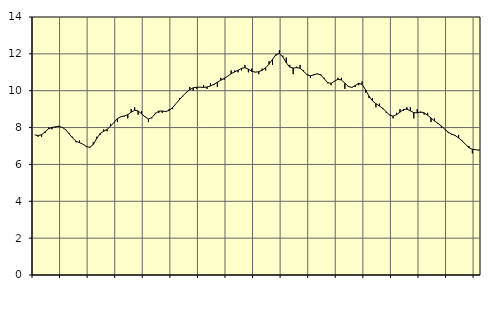
| Category | Piggar | Series 1 |
|---|---|---|
| nan | 7.6 | 7.6 |
| 87.0 | 7.5 | 7.57 |
| 87.0 | 7.5 | 7.61 |
| 87.0 | 7.7 | 7.77 |
| nan | 8 | 7.93 |
| 88.0 | 7.9 | 8.01 |
| 88.0 | 8 | 8.04 |
| 88.0 | 8.1 | 8.06 |
| nan | 8 | 8.01 |
| 89.0 | 7.9 | 7.88 |
| 89.0 | 7.7 | 7.66 |
| 89.0 | 7.5 | 7.43 |
| nan | 7.2 | 7.26 |
| 90.0 | 7.3 | 7.18 |
| 90.0 | 7.1 | 7.1 |
| 90.0 | 7 | 6.97 |
| nan | 6.9 | 6.93 |
| 91.0 | 7.2 | 7.09 |
| 91.0 | 7.5 | 7.41 |
| 91.0 | 7.6 | 7.68 |
| nan | 7.9 | 7.8 |
| 92.0 | 7.8 | 7.9 |
| 92.0 | 8.2 | 8.07 |
| 92.0 | 8.3 | 8.28 |
| nan | 8.3 | 8.49 |
| 93.0 | 8.6 | 8.59 |
| 93.0 | 8.6 | 8.63 |
| 93.0 | 8.5 | 8.7 |
| nan | 9 | 8.84 |
| 94.0 | 9.1 | 8.94 |
| 94.0 | 8.7 | 8.9 |
| 94.0 | 8.9 | 8.75 |
| nan | 8.6 | 8.58 |
| 95.0 | 8.3 | 8.47 |
| 95.0 | 8.5 | 8.54 |
| 95.0 | 8.8 | 8.76 |
| nan | 8.8 | 8.89 |
| 96.0 | 8.8 | 8.9 |
| 96.0 | 8.9 | 8.87 |
| 96.0 | 9 | 8.93 |
| nan | 9 | 9.08 |
| 97.0 | 9.3 | 9.3 |
| 97.0 | 9.6 | 9.52 |
| 97.0 | 9.7 | 9.72 |
| nan | 9.9 | 9.91 |
| 98.0 | 10.2 | 10.06 |
| 98.0 | 10 | 10.16 |
| 98.0 | 10.1 | 10.19 |
| nan | 10.2 | 10.19 |
| 99.0 | 10.3 | 10.18 |
| 99.0 | 10.1 | 10.2 |
| 99.0 | 10.4 | 10.26 |
| nan | 10.3 | 10.35 |
| 0.0 | 10.2 | 10.46 |
| 0.0 | 10.7 | 10.57 |
| 0.0 | 10.6 | 10.67 |
| nan | 10.8 | 10.79 |
| 1.0 | 11.1 | 10.92 |
| 1.0 | 11.1 | 11.02 |
| 1.0 | 11 | 11.11 |
| nan | 11.1 | 11.21 |
| 2.0 | 11.4 | 11.25 |
| 2.0 | 11 | 11.17 |
| 2.0 | 11.2 | 11.05 |
| nan | 11 | 11.01 |
| 3.0 | 10.9 | 11.03 |
| 3.0 | 11.2 | 11.11 |
| 3.0 | 11.1 | 11.24 |
| nan | 11.6 | 11.44 |
| 4.0 | 11.4 | 11.7 |
| 4.0 | 11.9 | 11.96 |
| 4.0 | 12.2 | 12.02 |
| nan | 11.9 | 11.83 |
| 5.0 | 11.8 | 11.52 |
| 5.0 | 11.4 | 11.28 |
| 5.0 | 10.9 | 11.23 |
| nan | 11.3 | 11.25 |
| 6.0 | 11.4 | 11.22 |
| 6.0 | 11.1 | 11.06 |
| 6.0 | 10.9 | 10.87 |
| nan | 10.7 | 10.81 |
| 7.0 | 10.9 | 10.86 |
| 7.0 | 10.9 | 10.92 |
| 7.0 | 10.9 | 10.86 |
| nan | 10.7 | 10.65 |
| 8.0 | 10.4 | 10.44 |
| 8.0 | 10.3 | 10.4 |
| 8.0 | 10.5 | 10.52 |
| nan | 10.7 | 10.62 |
| 9.0 | 10.7 | 10.58 |
| 9.0 | 10.1 | 10.41 |
| 9.0 | 10.2 | 10.23 |
| nan | 10.2 | 10.18 |
| 10.0 | 10.2 | 10.28 |
| 10.0 | 10.3 | 10.4 |
| 10.0 | 10.5 | 10.34 |
| nan | 9.9 | 10.05 |
| 11.0 | 9.6 | 9.71 |
| 11.0 | 9.6 | 9.45 |
| 11.0 | 9.1 | 9.3 |
| nan | 9.3 | 9.17 |
| 12.0 | 9 | 9.04 |
| 12.0 | 8.8 | 8.86 |
| 12.0 | 8.7 | 8.67 |
| nan | 8.5 | 8.62 |
| 13.0 | 8.8 | 8.7 |
| 13.0 | 9 | 8.84 |
| 13.0 | 8.9 | 8.98 |
| nan | 9.1 | 9 |
| 14.0 | 9.1 | 8.91 |
| 14.0 | 8.5 | 8.81 |
| 14.0 | 9 | 8.8 |
| nan | 8.8 | 8.85 |
| 15.0 | 8.7 | 8.8 |
| 15.0 | 8.8 | 8.67 |
| 15.0 | 8.3 | 8.52 |
| nan | 8.5 | 8.36 |
| 16.0 | 8.2 | 8.23 |
| 16.0 | 8 | 8.08 |
| 16.0 | 7.9 | 7.91 |
| nan | 7.7 | 7.75 |
| 17.0 | 7.6 | 7.64 |
| 17.0 | 7.6 | 7.57 |
| 17.0 | 7.6 | 7.44 |
| nan | 7.3 | 7.28 |
| 18.0 | 7.1 | 7.09 |
| 18.0 | 7 | 6.91 |
| 18.0 | 6.6 | 6.82 |
| nan | 6.8 | 6.8 |
| 19.0 | 6.8 | 6.77 |